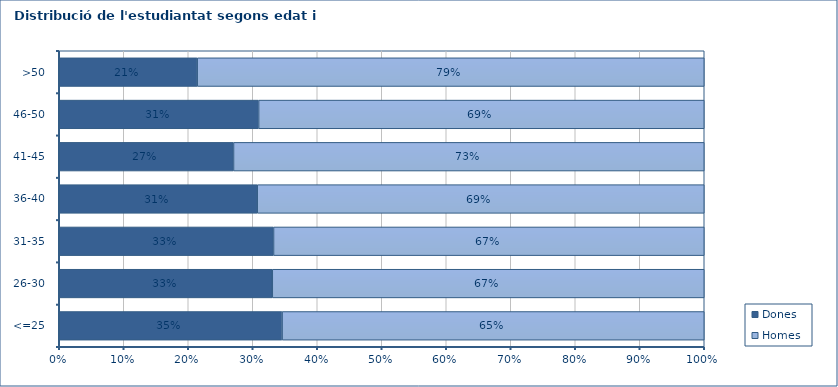
| Category | Dones | Homes |
|---|---|---|
| <=25 | 0.345 | 0.655 |
| 26-30 | 0.33 | 0.67 |
| 31-35 | 0.332 | 0.668 |
| 36-40 | 0.307 | 0.693 |
| 41-45 | 0.27 | 0.73 |
| 46-50 | 0.309 | 0.691 |
| >50 | 0.214 | 0.786 |